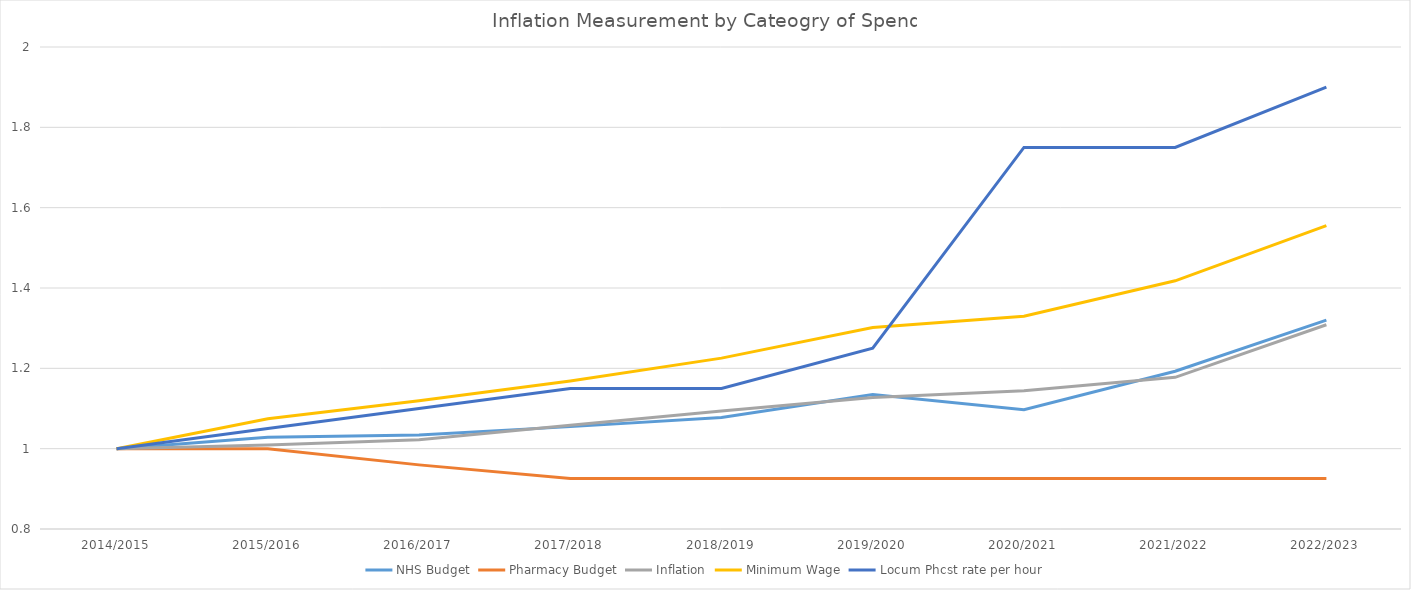
| Category | NHS Budget | Pharmacy Budget | Inflation | Minimum Wage | Locum Phcst rate per hour |
|---|---|---|---|---|---|
| 2014/2015 | 1 | 1 | 1 | 1 | 1 |
| 2015/2016 | 1.028 | 1 | 1.009 | 1.075 | 1.05 |
| 2016/2017 | 1.034 | 0.96 | 1.022 | 1.119 | 1.1 |
| 2017/2018 | 1.055 | 0.926 | 1.058 | 1.169 | 1.15 |
| 2018/2019 | 1.078 | 0.926 | 1.094 | 1.225 | 1.15 |
| 2019/2020 | 1.135 | 0.926 | 1.127 | 1.301 | 1.25 |
| 2020/2021 | 1.097 | 0.926 | 1.144 | 1.33 | 1.75 |
| 2021/2022 | 1.193 | 0.926 | 1.178 | 1.418 | 1.75 |
| 2022/2023 | 1.32 | 0.926 | 1.309 | 1.555 | 1.9 |